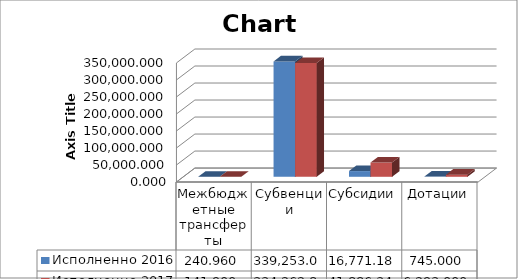
| Category | Исполненно 2016 | Исполненно 2017 |
|---|---|---|
| Межбюджетные трансферты | 240.96 | 141.9 |
| Субвенции | 339253.093 | 334262.809 |
| Субсидии | 16771.189 | 41886.348 |
| Дотации | 745 | 6293 |